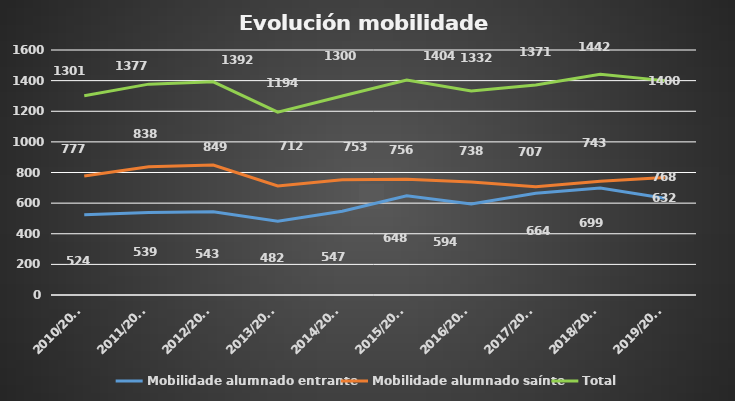
| Category | Mobilidade alumnado entrante | Mobilidade alumnado saínte | Total |
|---|---|---|---|
| 2010/2011 | 524 | 777 | 1301 |
| 2011/2012 | 539 | 838 | 1377 |
| 2012/2013 | 543 | 849 | 1392 |
| 2013/2014 | 482 | 712 | 1194 |
| 2014/2015 | 547 | 753 | 1300 |
| 2015/2016 | 648 | 756 | 1404 |
| 2016/2017 | 594 | 738 | 1332 |
| 2017/2018 | 664 | 707 | 1371 |
| 2018/2019 | 699 | 743 | 1442 |
| 2019/2020 | 632 | 768 | 1400 |